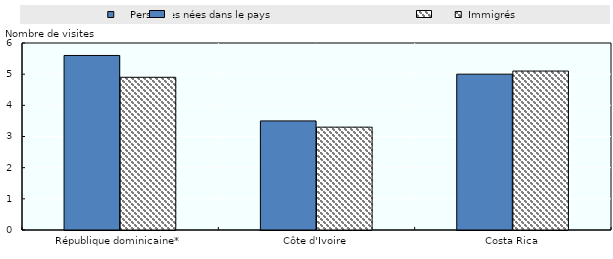
| Category |     Personnes nées dans le pays |  Immigrés |
|---|---|---|
| République dominicaine* | 5.6 | 4.9 |
| Côte d'Ivoire | 3.5 | 3.3 |
| Costa Rica | 5 | 5.1 |